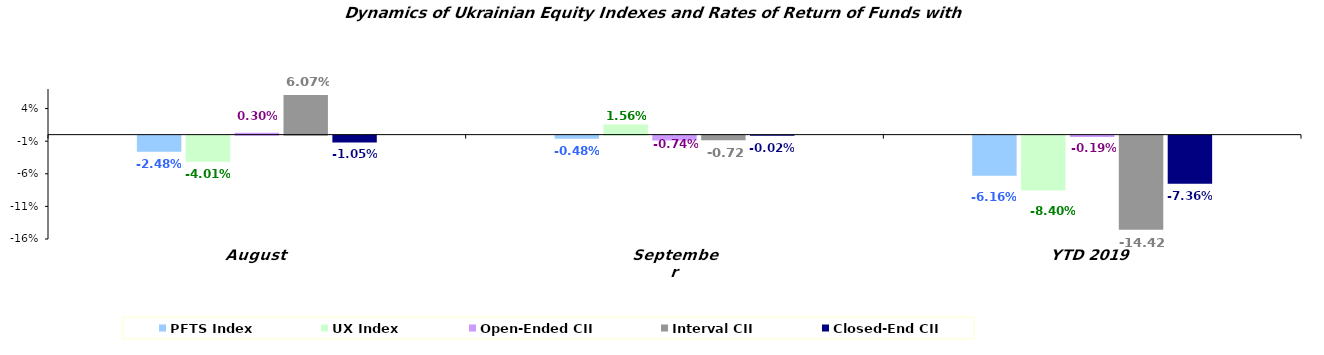
| Category | PFTS Index | UX Index | Open-Ended CII | Interval CII | Closed-End CII |
|---|---|---|---|---|---|
| August | -0.025 | -0.04 | 0.003 | 0.061 | -0.01 |
| September | -0.005 | 0.016 | -0.007 | -0.007 | 0 |
| YTD 2019 | -0.062 | -0.084 | -0.002 | -0.144 | -0.074 |